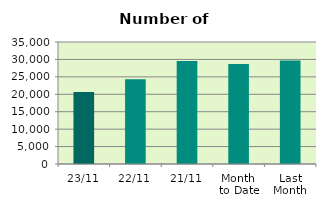
| Category | Series 0 |
|---|---|
| 23/11 | 20660 |
| 22/11 | 24334 |
| 21/11 | 29558 |
| Month 
to Date | 28671.765 |
| Last
Month | 29672.087 |